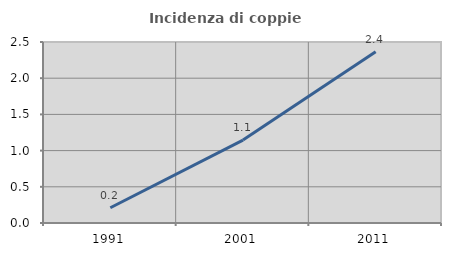
| Category | Incidenza di coppie miste |
|---|---|
| 1991.0 | 0.211 |
| 2001.0 | 1.145 |
| 2011.0 | 2.367 |